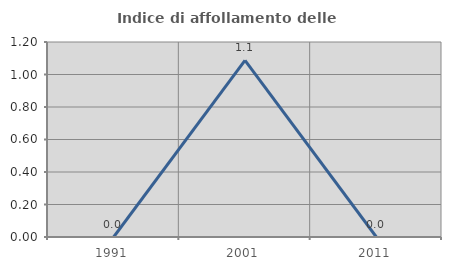
| Category | Indice di affollamento delle abitazioni  |
|---|---|
| 1991.0 | 0 |
| 2001.0 | 1.087 |
| 2011.0 | 0 |